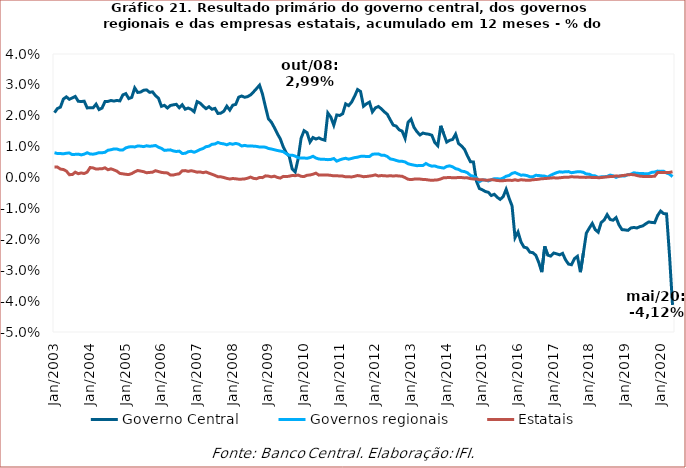
| Category | Governo Central | Governos regionais | Estatais |
|---|---|---|---|
| 2003-01-01 | 0.021 | 0.008 | 0.003 |
| 2003-02-01 | 0.022 | 0.008 | 0.003 |
| 2003-03-01 | 0.023 | 0.008 | 0.003 |
| 2003-04-01 | 0.025 | 0.008 | 0.003 |
| 2003-05-01 | 0.026 | 0.008 | 0.002 |
| 2003-06-01 | 0.025 | 0.008 | 0.001 |
| 2003-07-01 | 0.026 | 0.007 | 0.001 |
| 2003-08-01 | 0.026 | 0.008 | 0.002 |
| 2003-09-01 | 0.025 | 0.008 | 0.001 |
| 2003-10-01 | 0.025 | 0.007 | 0.001 |
| 2003-11-01 | 0.025 | 0.008 | 0.001 |
| 2003-12-01 | 0.023 | 0.008 | 0.002 |
| 2004-01-01 | 0.023 | 0.008 | 0.003 |
| 2004-02-01 | 0.023 | 0.008 | 0.003 |
| 2004-03-01 | 0.024 | 0.008 | 0.003 |
| 2004-04-01 | 0.022 | 0.008 | 0.003 |
| 2004-05-01 | 0.023 | 0.008 | 0.003 |
| 2004-06-01 | 0.025 | 0.008 | 0.003 |
| 2004-07-01 | 0.025 | 0.009 | 0.003 |
| 2004-08-01 | 0.025 | 0.009 | 0.003 |
| 2004-09-01 | 0.025 | 0.009 | 0.002 |
| 2004-10-01 | 0.025 | 0.009 | 0.002 |
| 2004-11-01 | 0.025 | 0.009 | 0.001 |
| 2004-12-01 | 0.027 | 0.009 | 0.001 |
| 2005-01-01 | 0.027 | 0.01 | 0.001 |
| 2005-02-01 | 0.026 | 0.01 | 0.001 |
| 2005-03-01 | 0.026 | 0.01 | 0.001 |
| 2005-04-01 | 0.029 | 0.01 | 0.002 |
| 2005-05-01 | 0.028 | 0.01 | 0.002 |
| 2005-06-01 | 0.028 | 0.01 | 0.002 |
| 2005-07-01 | 0.028 | 0.01 | 0.002 |
| 2005-08-01 | 0.028 | 0.01 | 0.002 |
| 2005-09-01 | 0.028 | 0.01 | 0.002 |
| 2005-10-01 | 0.028 | 0.01 | 0.002 |
| 2005-11-01 | 0.027 | 0.01 | 0.002 |
| 2005-12-01 | 0.026 | 0.01 | 0.002 |
| 2006-01-01 | 0.023 | 0.009 | 0.002 |
| 2006-02-01 | 0.023 | 0.009 | 0.002 |
| 2006-03-01 | 0.023 | 0.009 | 0.002 |
| 2006-04-01 | 0.023 | 0.009 | 0.001 |
| 2006-05-01 | 0.024 | 0.009 | 0.001 |
| 2006-06-01 | 0.024 | 0.008 | 0.001 |
| 2006-07-01 | 0.023 | 0.009 | 0.001 |
| 2006-08-01 | 0.024 | 0.008 | 0.002 |
| 2006-09-01 | 0.022 | 0.008 | 0.002 |
| 2006-10-01 | 0.023 | 0.008 | 0.002 |
| 2006-11-01 | 0.022 | 0.009 | 0.002 |
| 2006-12-01 | 0.021 | 0.008 | 0.002 |
| 2007-01-01 | 0.025 | 0.009 | 0.002 |
| 2007-02-01 | 0.024 | 0.009 | 0.002 |
| 2007-03-01 | 0.023 | 0.009 | 0.002 |
| 2007-04-01 | 0.022 | 0.01 | 0.002 |
| 2007-05-01 | 0.023 | 0.01 | 0.001 |
| 2007-06-01 | 0.022 | 0.011 | 0.001 |
| 2007-07-01 | 0.022 | 0.011 | 0.001 |
| 2007-08-01 | 0.021 | 0.011 | 0 |
| 2007-09-01 | 0.021 | 0.011 | 0 |
| 2007-10-01 | 0.021 | 0.011 | 0 |
| 2007-11-01 | 0.023 | 0.011 | 0 |
| 2007-12-01 | 0.022 | 0.011 | 0 |
| 2008-01-01 | 0.023 | 0.011 | 0 |
| 2008-02-01 | 0.024 | 0.011 | 0 |
| 2008-03-01 | 0.026 | 0.011 | -0.001 |
| 2008-04-01 | 0.026 | 0.01 | -0.001 |
| 2008-05-01 | 0.026 | 0.01 | 0 |
| 2008-06-01 | 0.026 | 0.01 | 0 |
| 2008-07-01 | 0.027 | 0.01 | 0 |
| 2008-08-01 | 0.028 | 0.01 | 0 |
| 2008-09-01 | 0.029 | 0.01 | 0 |
| 2008-10-01 | 0.03 | 0.01 | 0 |
| 2008-11-01 | 0.027 | 0.01 | 0 |
| 2008-12-01 | 0.023 | 0.01 | 0.001 |
| 2009-01-01 | 0.019 | 0.009 | 0 |
| 2009-02-01 | 0.018 | 0.009 | 0 |
| 2009-03-01 | 0.016 | 0.009 | 0 |
| 2009-04-01 | 0.014 | 0.009 | 0 |
| 2009-05-01 | 0.013 | 0.009 | 0 |
| 2009-06-01 | 0.01 | 0.008 | 0 |
| 2009-07-01 | 0.008 | 0.008 | 0 |
| 2009-08-01 | 0.007 | 0.007 | 0 |
| 2009-09-01 | 0.003 | 0.007 | 0.001 |
| 2009-10-01 | 0.002 | 0.007 | 0.001 |
| 2009-11-01 | 0.006 | 0.006 | 0.001 |
| 2009-12-01 | 0.013 | 0.006 | 0 |
| 2010-01-01 | 0.015 | 0.006 | 0 |
| 2010-02-01 | 0.015 | 0.006 | 0.001 |
| 2010-03-01 | 0.012 | 0.006 | 0.001 |
| 2010-04-01 | 0.013 | 0.007 | 0.001 |
| 2010-05-01 | 0.012 | 0.006 | 0.001 |
| 2010-06-01 | 0.013 | 0.006 | 0.001 |
| 2010-07-01 | 0.012 | 0.006 | 0.001 |
| 2010-08-01 | 0.012 | 0.006 | 0.001 |
| 2010-09-01 | 0.021 | 0.006 | 0.001 |
| 2010-10-01 | 0.02 | 0.006 | 0.001 |
| 2010-11-01 | 0.017 | 0.006 | 0.001 |
| 2010-12-01 | 0.02 | 0.005 | 0.001 |
| 2011-01-01 | 0.02 | 0.006 | 0 |
| 2011-02-01 | 0.021 | 0.006 | 0 |
| 2011-03-01 | 0.024 | 0.006 | 0 |
| 2011-04-01 | 0.023 | 0.006 | 0 |
| 2011-05-01 | 0.024 | 0.006 | 0 |
| 2011-06-01 | 0.026 | 0.006 | 0 |
| 2011-07-01 | 0.028 | 0.007 | 0.001 |
| 2011-08-01 | 0.028 | 0.007 | 0.001 |
| 2011-09-01 | 0.023 | 0.007 | 0 |
| 2011-10-01 | 0.024 | 0.007 | 0 |
| 2011-11-01 | 0.024 | 0.007 | 0 |
| 2011-12-01 | 0.021 | 0.008 | 0.001 |
| 2012-01-01 | 0.023 | 0.008 | 0.001 |
| 2012-02-01 | 0.023 | 0.008 | 0.001 |
| 2012-03-01 | 0.022 | 0.007 | 0.001 |
| 2012-04-01 | 0.021 | 0.007 | 0.001 |
| 2012-05-01 | 0.02 | 0.007 | 0 |
| 2012-06-01 | 0.019 | 0.006 | 0.001 |
| 2012-07-01 | 0.017 | 0.006 | 0 |
| 2012-08-01 | 0.017 | 0.006 | 0.001 |
| 2012-09-01 | 0.015 | 0.005 | 0 |
| 2012-10-01 | 0.015 | 0.005 | 0 |
| 2012-11-01 | 0.013 | 0.005 | 0 |
| 2012-12-01 | 0.018 | 0.004 | -0.001 |
| 2013-01-01 | 0.019 | 0.004 | -0.001 |
| 2013-02-01 | 0.016 | 0.004 | -0.001 |
| 2013-03-01 | 0.015 | 0.004 | 0 |
| 2013-04-01 | 0.014 | 0.004 | 0 |
| 2013-05-01 | 0.014 | 0.004 | -0.001 |
| 2013-06-01 | 0.014 | 0.005 | -0.001 |
| 2013-07-01 | 0.014 | 0.004 | -0.001 |
| 2013-08-01 | 0.014 | 0.004 | -0.001 |
| 2013-09-01 | 0.011 | 0.004 | -0.001 |
| 2013-10-01 | 0.01 | 0.003 | -0.001 |
| 2013-11-01 | 0.017 | 0.003 | 0 |
| 2013-12-01 | 0.014 | 0.003 | 0 |
| 2014-01-01 | 0.011 | 0.004 | 0 |
| 2014-02-01 | 0.012 | 0.004 | 0 |
| 2014-03-01 | 0.012 | 0.003 | 0 |
| 2014-04-01 | 0.014 | 0.003 | 0 |
| 2014-05-01 | 0.011 | 0.003 | 0 |
| 2014-06-01 | 0.01 | 0.002 | 0 |
| 2014-07-01 | 0.009 | 0.002 | 0 |
| 2014-08-01 | 0.007 | 0.002 | 0 |
| 2014-09-01 | 0.005 | 0.001 | 0 |
| 2014-10-01 | 0.005 | 0 | 0 |
| 2014-11-01 | -0.001 | 0 | 0 |
| 2014-12-01 | -0.004 | -0.001 | -0.001 |
| 2015-01-01 | -0.004 | -0.001 | -0.001 |
| 2015-02-01 | -0.005 | -0.001 | -0.001 |
| 2015-03-01 | -0.005 | -0.001 | -0.001 |
| 2015-04-01 | -0.006 | -0.001 | -0.001 |
| 2015-05-01 | -0.005 | 0 | -0.001 |
| 2015-06-01 | -0.006 | 0 | -0.001 |
| 2015-07-01 | -0.007 | -0.001 | -0.001 |
| 2015-08-01 | -0.006 | 0 | -0.001 |
| 2015-09-01 | -0.004 | 0 | -0.001 |
| 2015-10-01 | -0.007 | 0.001 | -0.001 |
| 2015-11-01 | -0.009 | 0.001 | -0.001 |
| 2015-12-01 | -0.019 | 0.002 | -0.001 |
| 2016-01-01 | -0.018 | 0.001 | -0.001 |
| 2016-02-01 | -0.021 | 0.001 | -0.001 |
| 2016-03-01 | -0.023 | 0.001 | -0.001 |
| 2016-04-01 | -0.023 | 0.001 | -0.001 |
| 2016-05-01 | -0.024 | 0 | -0.001 |
| 2016-06-01 | -0.024 | 0 | -0.001 |
| 2016-07-01 | -0.025 | 0.001 | -0.001 |
| 2016-08-01 | -0.028 | 0.001 | -0.001 |
| 2016-09-01 | -0.031 | 0.001 | 0 |
| 2016-10-01 | -0.022 | 0 | 0 |
| 2016-11-01 | -0.025 | 0 | 0 |
| 2016-12-01 | -0.025 | 0.001 | 0 |
| 2017-01-01 | -0.024 | 0.001 | 0 |
| 2017-02-01 | -0.025 | 0.002 | 0 |
| 2017-03-01 | -0.025 | 0.002 | 0 |
| 2017-04-01 | -0.025 | 0.002 | 0 |
| 2017-05-01 | -0.027 | 0.002 | 0 |
| 2017-06-01 | -0.028 | 0.002 | 0 |
| 2017-07-01 | -0.028 | 0.002 | 0 |
| 2017-08-01 | -0.026 | 0.002 | 0 |
| 2017-09-01 | -0.025 | 0.002 | 0 |
| 2017-10-01 | -0.031 | 0.002 | 0 |
| 2017-11-01 | -0.024 | 0.002 | 0 |
| 2017-12-01 | -0.018 | 0.001 | 0 |
| 2018-01-01 | -0.016 | 0.001 | 0 |
| 2018-02-01 | -0.015 | 0.001 | 0 |
| 2018-03-01 | -0.017 | 0.001 | 0 |
| 2018-04-01 | -0.018 | 0 | 0 |
| 2018-05-01 | -0.015 | 0 | 0 |
| 2018-06-01 | -0.014 | 0 | 0 |
| 2018-07-01 | -0.012 | 0 | 0 |
| 2018-08-01 | -0.014 | 0.001 | 0 |
| 2018-09-01 | -0.014 | 0.001 | 0 |
| 2018-10-01 | -0.013 | 0 | 0.001 |
| 2018-11-01 | -0.015 | 0 | 0 |
| 2018-12-01 | -0.017 | 0.001 | 0.001 |
| 2019-01-01 | -0.017 | 0.001 | 0.001 |
| 2019-02-01 | -0.017 | 0.001 | 0.001 |
| 2019-03-01 | -0.016 | 0.001 | 0.001 |
| 2019-04-01 | -0.016 | 0.002 | 0.001 |
| 2019-05-01 | -0.016 | 0.001 | 0.001 |
| 2019-06-01 | -0.016 | 0.001 | 0 |
| 2019-07-01 | -0.016 | 0.001 | 0 |
| 2019-08-01 | -0.015 | 0.001 | 0 |
| 2019-09-01 | -0.014 | 0.001 | 0 |
| 2019-10-01 | -0.015 | 0.002 | 0 |
| 2019-11-01 | -0.015 | 0.002 | 0 |
| 2019-12-01 | -0.012 | 0.002 | 0.002 |
| 2020-01-01 | -0.011 | 0.002 | 0.002 |
| 2020-02-01 | -0.012 | 0.002 | 0.002 |
| 2020-03-01 | -0.012 | 0.001 | 0.002 |
| 2020-04-01 | -0.025 | 0.001 | 0.002 |
| 2020-05-01 | -0.041 | 0 | 0.002 |